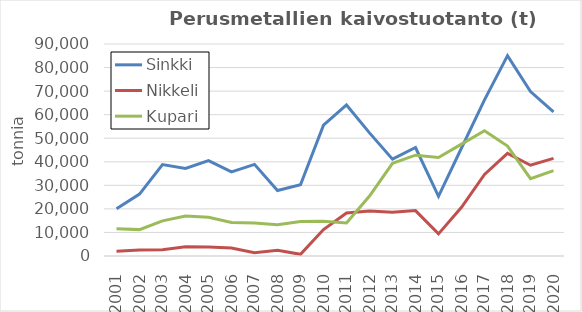
| Category | Sinkki | Nikkeli | Kupari |
|---|---|---|---|
| 2001.0 | 20100 | 2000 | 11600 |
| 2002.0 | 26300 | 2500 | 11200 |
| 2003.0 | 38800 | 2700 | 14900 |
| 2004.0 | 37200 | 3950.61 | 16948.557 |
| 2005.0 | 40500 | 3866.388 | 16417.676 |
| 2006.0 | 35700 | 3402.81 | 14247.697 |
| 2007.0 | 38900 | 1426 | 13977 |
| 2008.0 | 27800 | 2400 | 13300 |
| 2009.0 | 30233 | 735 | 14600 |
| 2010.0 | 55562 | 11240 | 14700 |
| 2011.0 | 64115 | 18244 | 14000 |
| 2012.0 | 52265 | 19073 | 25445 |
| 2013.0 | 41124 | 18560 | 39342 |
| 2014.0 | 46063 | 19281 | 42810 |
| 2015.0 | 25332 | 9383 | 41805 |
| 2016.0 | 45852 | 20654 | 47488 |
| 2017.0 | 66284 | 34641 | 53144 |
| 2018.0 | 85067 | 43572 | 46674 |
| 2019.0 | 69800 | 38530 | 32861 |
| 2020.0 | 61213 | 41429 | 36278 |